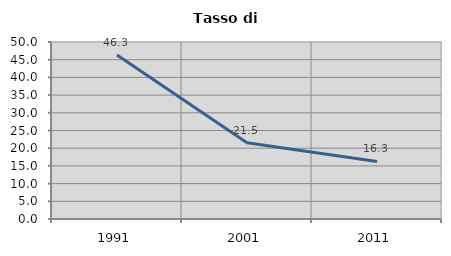
| Category | Tasso di disoccupazione   |
|---|---|
| 1991.0 | 46.306 |
| 2001.0 | 21.528 |
| 2011.0 | 16.272 |